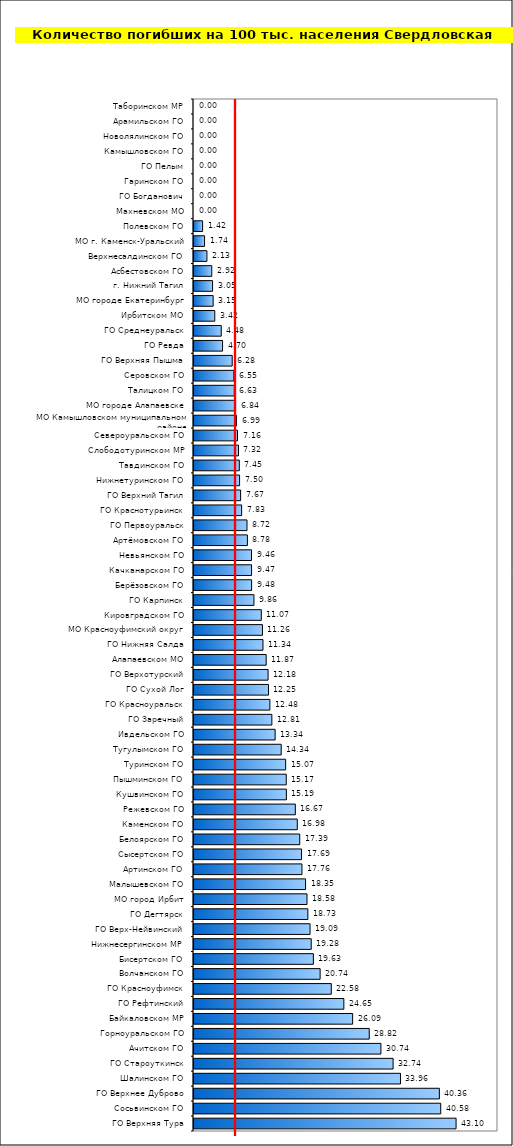
| Category | Series 0 |
|---|---|
| ГО Верхняя Тура | 43.103 |
| Сосьвинском ГО | 40.579 |
| ГО Верхнее Дуброво | 40.355 |
| Шалинском ГО | 33.961 |
| ГО Староуткинск | 32.744 |
| Ачитском ГО | 30.743 |
| Горноуральском ГО | 28.821 |
| Байкаловском МР | 26.091 |
| ГО Рефтинский | 24.647 |
| ГО Красноуфимск | 22.577 |
| Волчанском ГО | 20.743 |
| Бисертском ГО | 19.635 |
| Нижнесергинском МР | 19.278 |
| ГО Верх-Нейвинский | 19.088 |
| ГО Дегтярск | 18.729 |
| МО город Ирбит | 18.585 |
| Малышевском ГО | 18.347 |
| Артинском ГО | 17.756 |
| Сысертском ГО | 17.686 |
| Белоярском ГО | 17.392 |
| Каменском ГО | 16.985 |
| Режевском ГО | 16.666 |
| Кушвинском ГО | 15.194 |
| Пышминском ГО | 15.171 |
| Туринском ГО | 15.074 |
| Тугулымском ГО | 14.342 |
| Ивдельском ГО | 13.343 |
| ГО Заречный | 12.808 |
| ГО Красноуральск | 12.482 |
| ГО Сухой Лог | 12.252 |
| ГО Верхотурский | 12.183 |
| Алапаевском МО | 11.869 |
| ГО Нижняя Салда | 11.345 |
| МО Красноуфимский округ | 11.257 |
| Кировградском ГО | 11.065 |
| ГО Карпинск | 9.859 |
| Берёзовском ГО | 9.478 |
| Качканарском ГО | 9.47 |
| Невьянском ГО | 9.461 |
| Артёмовском ГО | 8.777 |
| ГО Первоуральск | 8.717 |
| ГО Краснотурьинск | 7.834 |
| ГО Верхний Тагил | 7.666 |
| Нижнетуринском ГО | 7.497 |
| Тавдинском ГО | 7.449 |
| Слободотуринском МР | 7.319 |
| Североуральском ГО | 7.155 |
| МО Камышловском муниципальном районе | 6.994 |
| МО городе Алапаевске | 6.837 |
| Талицком ГО | 6.63 |
| Серовском ГО | 6.55 |
| ГО Верхняя Пышма | 6.281 |
| ГО Ревда | 4.697 |
| ГО Среднеуральск | 4.477 |
| Ирбитском МО | 3.416 |
| МО городе Екатеринбург | 3.147 |
| г. Нижний Тагил | 3.055 |
| Асбестовском ГО | 2.922 |
| Верхнесалдинском ГО | 2.126 |
| МО г. Каменск-Уральский | 1.737 |
| Полевском ГО | 1.416 |
| Махневском МО | 0 |
| ГО Богданович | 0 |
| Гаринском ГО | 0 |
| ГО Пелым | 0 |
| Камышловском ГО | 0 |
| Новолялинском ГО | 0 |
| Арамильском ГО | 0 |
| Таборинском МР | 0 |